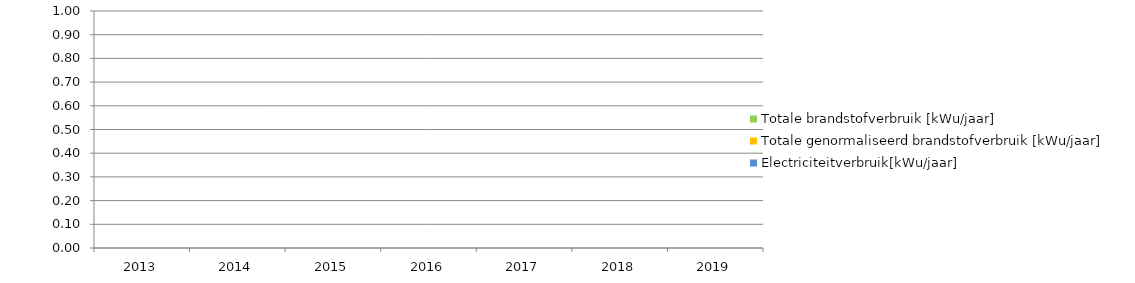
| Category | Totale brandstofverbruik [kWu/jaar]
 | Totale genormaliseerd brandstofverbruik [kWu/jaar]
 | Electriciteitverbruik[kWu/jaar]
 |
|---|---|---|---|
| 2013 | 0 | 0 |  |
| 2014 | 0 | 0 |  |
| 2015 | 0 | 0 |  |
| 2016 | 0 | 0 |  |
| 2017 | 0 | 0 |  |
| 2018 | 0 | 0 |  |
| 2019 | 0 | 0 |  |